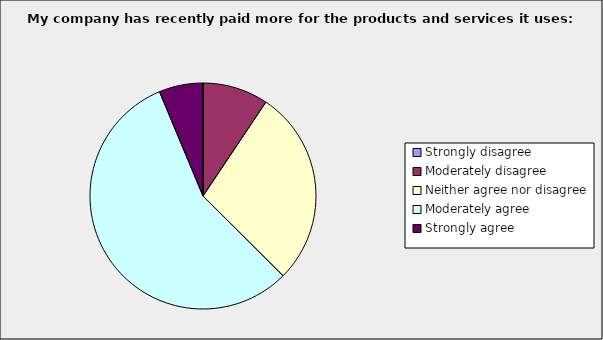
| Category | Series 0 |
|---|---|
| Strongly disagree | 0 |
| Moderately disagree | 0.094 |
| Neither agree nor disagree | 0.281 |
| Moderately agree | 0.563 |
| Strongly agree | 0.063 |